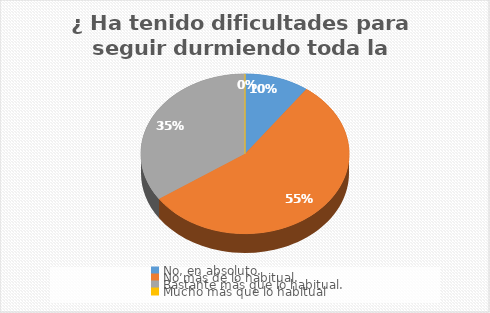
| Category | ¿ Ha tenido dificultades para seguir durmiendo toda la noche? |
|---|---|
| No, en absoluto. | 11 |
| No más de lo habitual. | 61 |
| Bastante más que lo habitual. | 38 |
| Mucho más que lo habitual | 0 |